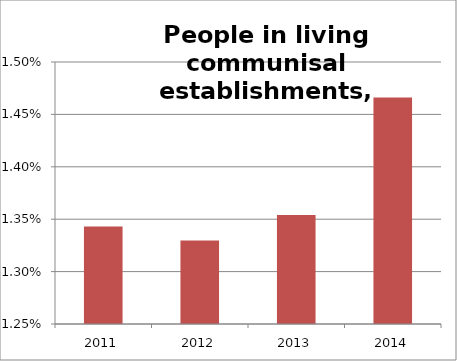
| Category | Series 1 |
|---|---|
| 2011.0 | 0.013 |
| 2012.0 | 0.013 |
| 2013.0 | 0.014 |
| 2014.0 | 0.015 |